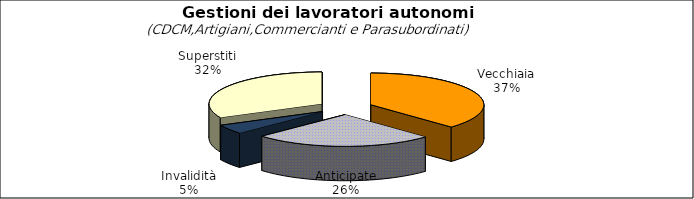
| Category | Series 0 |
|---|---|
| Vecchiaia | 88282 |
| Anticipate | 60742 |
| Invalidità | 11181 |
| Superstiti | 75820 |